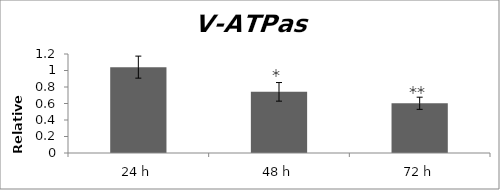
| Category | Series 0 |
|---|---|
| 24 h | 1.041 |
| 48 h | 0.741 |
| 72 h | 0.603 |